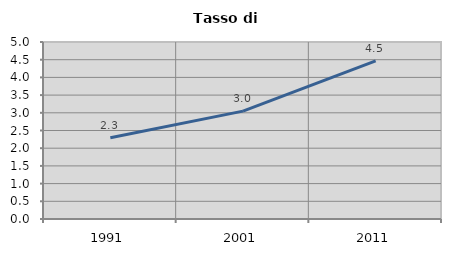
| Category | Tasso di disoccupazione   |
|---|---|
| 1991.0 | 2.295 |
| 2001.0 | 3.047 |
| 2011.0 | 4.468 |